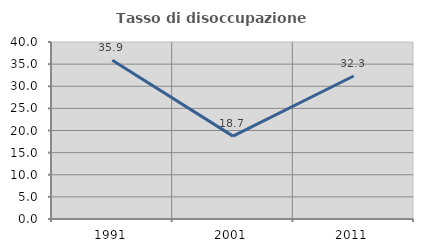
| Category | Tasso di disoccupazione giovanile  |
|---|---|
| 1991.0 | 35.853 |
| 2001.0 | 18.732 |
| 2011.0 | 32.323 |